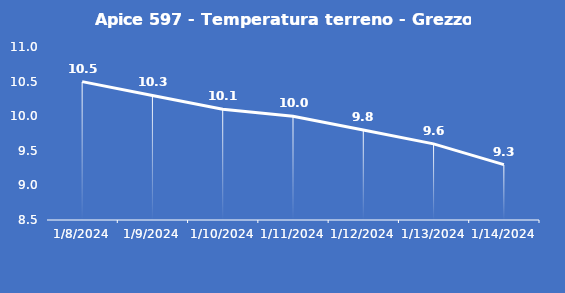
| Category | Apice 597 - Temperatura terreno - Grezzo (°C) |
|---|---|
| 1/8/24 | 10.5 |
| 1/9/24 | 10.3 |
| 1/10/24 | 10.1 |
| 1/11/24 | 10 |
| 1/12/24 | 9.8 |
| 1/13/24 | 9.6 |
| 1/14/24 | 9.3 |